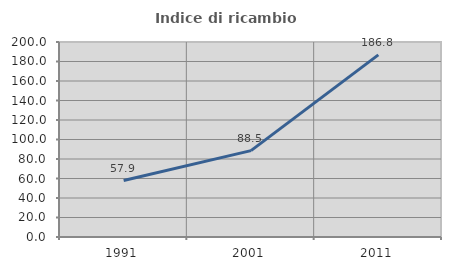
| Category | Indice di ricambio occupazionale  |
|---|---|
| 1991.0 | 57.895 |
| 2001.0 | 88.55 |
| 2011.0 | 186.813 |